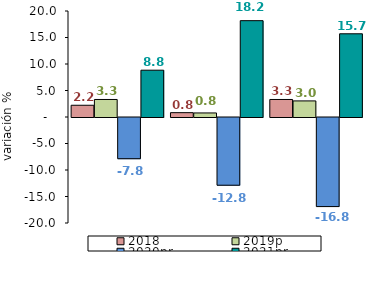
| Category | 2018 | 2019p | 2020pr | 2021pr |
|---|---|---|---|---|
| 0 | 2.216 | 3.307 | -7.775 | 8.83 |
| 1 | 0.818 | 0.764 | -12.779 | 18.178 |
| 2 | 3.306 | 3.034 | -16.808 | 15.702 |